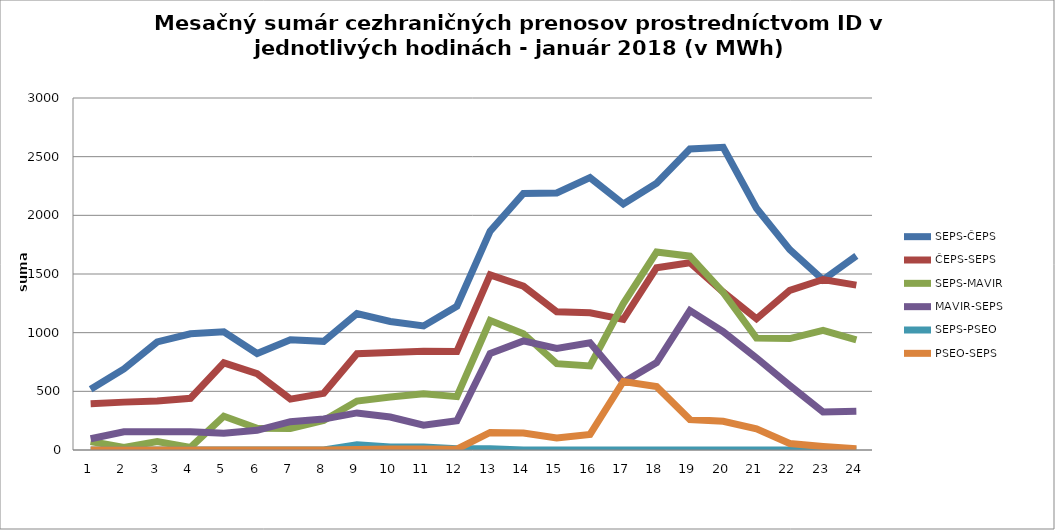
| Category | SEPS-ČEPS | ČEPS-SEPS | SEPS-MAVIR | MAVIR-SEPS | SEPS-PSEO | PSEO-SEPS |
|---|---|---|---|---|---|---|
| 1.0 | 517 | 394 | 72 | 96 | 0 | 0 |
| 2.0 | 691 | 408 | 22 | 155 | 0 | 0 |
| 3.0 | 921 | 418 | 72 | 155 | 0 | 0 |
| 4.0 | 990 | 441 | 22 | 155 | 0 | 0 |
| 5.0 | 1007 | 743 | 288 | 142 | 0 | 0 |
| 6.0 | 822 | 651 | 185 | 168 | 0 | 0 |
| 7.0 | 940 | 434 | 183 | 241 | 0 | 0 |
| 8.0 | 926 | 483 | 251 | 265 | 0 | 0 |
| 9.0 | 1163 | 820 | 417 | 316 | 45 | 5 |
| 10.0 | 1095 | 832 | 451 | 281 | 25 | 9 |
| 11.0 | 1057 | 841 | 480 | 212 | 25 | 9 |
| 12.0 | 1225 | 840 | 455 | 249 | 10 | 7 |
| 13.0 | 1865 | 1492 | 1103 | 823 | 10 | 150 |
| 14.0 | 2186 | 1396 | 991 | 930 | 0 | 144 |
| 15.0 | 2191 | 1178 | 736 | 865 | 0 | 103 |
| 16.0 | 2321 | 1169 | 717 | 914 | 0 | 133 |
| 17.0 | 2097 | 1113 | 1248 | 577 | 0 | 584 |
| 18.0 | 2273 | 1554 | 1687 | 745 | 0 | 540 |
| 19.0 | 2565 | 1596 | 1652 | 1189 | 0 | 259 |
| 20.0 | 2580 | 1346 | 1343 | 1008 | 0 | 245 |
| 21.0 | 2060 | 1118 | 954 | 785 | 0 | 181 |
| 22.0 | 1707 | 1360 | 950 | 550 | 0 | 55 |
| 23.0 | 1451 | 1453 | 1019 | 324 | 0 | 30 |
| 24.0 | 1655 | 1405 | 939 | 330 | 0 | 10 |